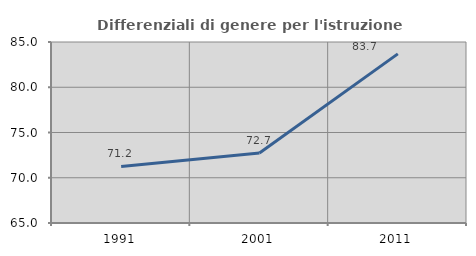
| Category | Differenziali di genere per l'istruzione superiore |
|---|---|
| 1991.0 | 71.248 |
| 2001.0 | 72.737 |
| 2011.0 | 83.69 |